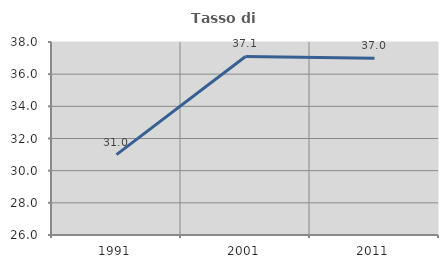
| Category | Tasso di occupazione   |
|---|---|
| 1991.0 | 30.995 |
| 2001.0 | 37.101 |
| 2011.0 | 36.986 |